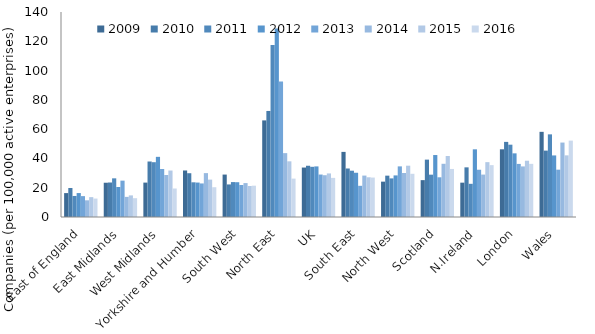
| Category | 2009 | 2010 | 2011 | 2012 | 2013 | 2014 | 2015 | 2016 |
|---|---|---|---|---|---|---|---|---|
| East of England | 16.323 | 19.798 | 14.37 | 16.349 | 14.26 | 11.402 | 13.566 | 12.597 |
| East Midlands | 23.4 | 23.562 | 26.406 | 20.488 | 24.83 | 13.743 | 14.754 | 12.841 |
| West Midlands | 23.493 | 37.899 | 37.42 | 41.084 | 32.79 | 28.677 | 31.734 | 19.46 |
| Yorkshire and Humber | 31.77 | 29.898 | 23.691 | 23.517 | 22.915 | 29.971 | 25.524 | 20.339 |
| South West | 28.977 | 22.239 | 23.848 | 23.756 | 21.871 | 23.158 | 21.17 | 21.385 |
| North East | 65.975 | 72.424 | 117.386 | 128.678 | 92.579 | 43.621 | 38.023 | 26.221 |
| UK | 33.776 | 35 | 34.278 | 34.556 | 28.994 | 28.539 | 29.753 | 26.708 |
| South East | 44.463 | 33.129 | 31.617 | 30.214 | 21.298 | 28.283 | 27.125 | 26.938 |
| North West | 24.143 | 28.237 | 26.368 | 28.399 | 34.573 | 30.064 | 35.035 | 29.507 |
| Scotland | 25.178 | 39.179 | 28.91 | 42.319 | 27.122 | 36.34 | 41.645 | 32.807 |
| N.Ireland | 23.451 | 33.907 | 22.66 | 46.218 | 32.27 | 28.965 | 37.46 | 35.422 |
| London | 46.232 | 51.299 | 49.384 | 43.468 | 36.256 | 34.543 | 38.425 | 36.303 |
| Wales | 58.162 | 45.336 | 56.44 | 42.053 | 32.312 | 50.841 | 42.101 | 52.163 |